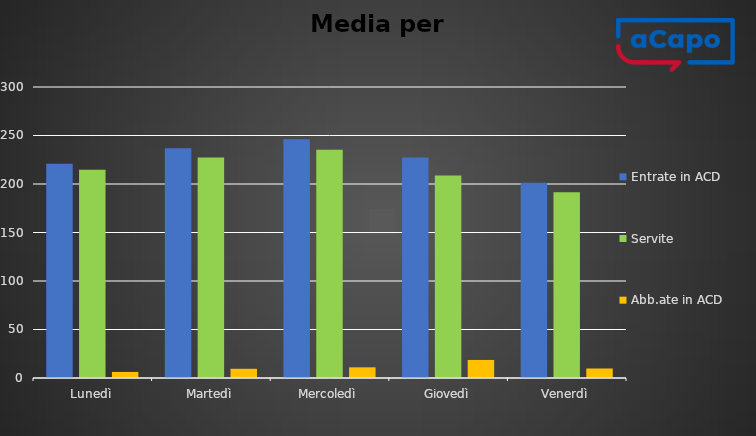
| Category | Entrate in ACD | Servite | Abb.ate in ACD |
|---|---|---|---|
| Lunedì | 221 | 214.75 | 6.25 |
| Martedì | 236.75 | 227.25 | 9.5 |
| Mercoledì | 246.25 | 235.25 | 11 |
| Giovedì | 227.4 | 208.8 | 18.6 |
| Venerdì | 201.4 | 191.6 | 9.8 |